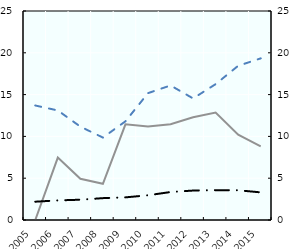
| Category |   Unemployment benefit recipients |   Recipients of ZPIZ partial disability benefit |
|---|---|---|
| 2005.0 | 0 | 2.19 |
| 2006.0 | 7.47 | 2.345 |
| 2007.0 | 4.938 | 2.426 |
| 2008.0 | 4.335 | 2.615 |
| 2009.0 | 11.441 | 2.706 |
| 2010.0 | 11.198 | 2.958 |
| 2011.0 | 11.459 | 3.346 |
| 2012.0 | 12.28 | 3.522 |
| 2013.0 | 12.862 | 3.573 |
| 2014.0 | 10.206 | 3.558 |
| 2015.0 | 8.818 | 3.304 |